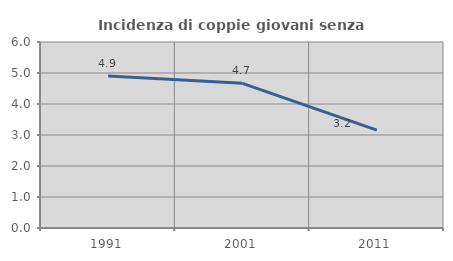
| Category | Incidenza di coppie giovani senza figli |
|---|---|
| 1991.0 | 4.901 |
| 2001.0 | 4.666 |
| 2011.0 | 3.155 |